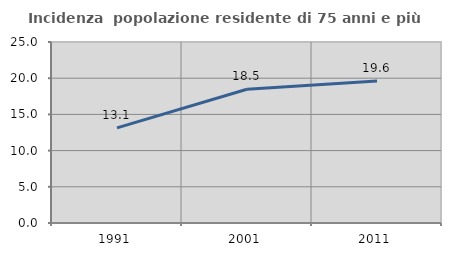
| Category | Incidenza  popolazione residente di 75 anni e più |
|---|---|
| 1991.0 | 13.143 |
| 2001.0 | 18.468 |
| 2011.0 | 19.622 |